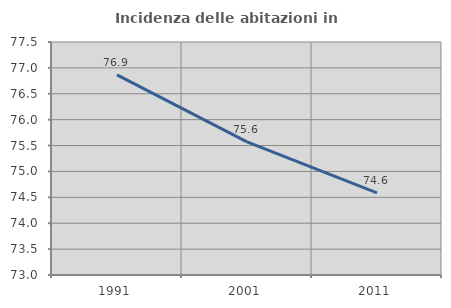
| Category | Incidenza delle abitazioni in proprietà  |
|---|---|
| 1991.0 | 76.864 |
| 2001.0 | 75.573 |
| 2011.0 | 74.586 |